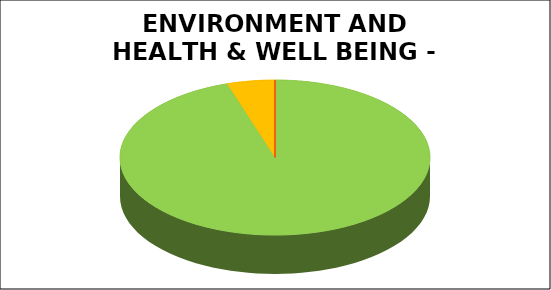
| Category | Series 0 |
|---|---|
| Green | 0.95 |
| Amber | 0.05 |
| Red | 0 |